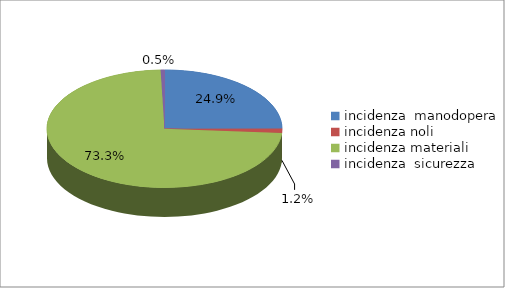
| Category | Series 0 |
|---|---|
| incidenza  manodopera  | 0.249 |
| incidenza noli  | 0.012 |
| incidenza materiali | 0.733 |
| incidenza  sicurezza | 0.005 |